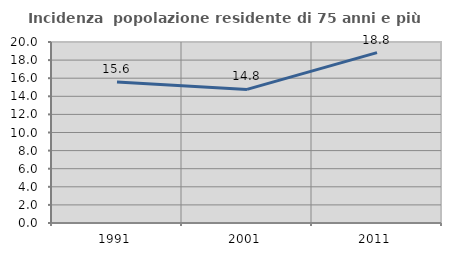
| Category | Incidenza  popolazione residente di 75 anni e più |
|---|---|
| 1991.0 | 15.592 |
| 2001.0 | 14.761 |
| 2011.0 | 18.82 |